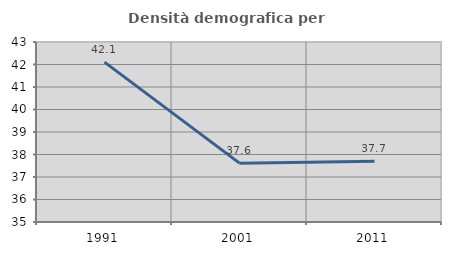
| Category | Densità demografica |
|---|---|
| 1991.0 | 42.104 |
| 2001.0 | 37.617 |
| 2011.0 | 37.704 |